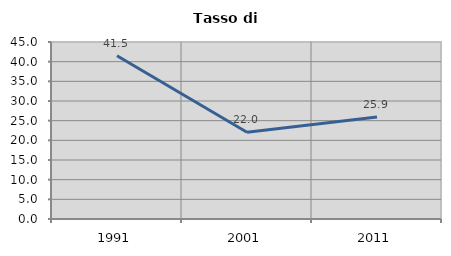
| Category | Tasso di disoccupazione   |
|---|---|
| 1991.0 | 41.488 |
| 2001.0 | 22.041 |
| 2011.0 | 25.904 |